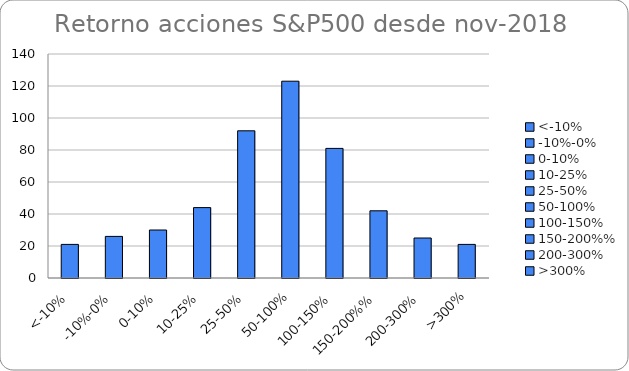
| Category | Series 0 |
|---|---|
| <-10% | 21 |
| -10%-0% | 26 |
| 0-10% | 30 |
| 10-25% | 44 |
| 25-50% | 92 |
| 50-100% | 123 |
| 100-150% | 81 |
| 150-200%% | 42 |
| 200-300% | 25 |
| >300% | 21 |